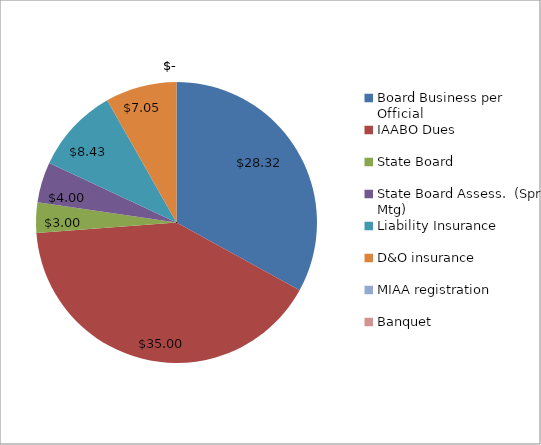
| Category | Series 0 |
|---|---|
| Board Business per Official | 28.318 |
| IAABO Dues | 35 |
| State Board | 3 |
| State Board Assess.  (Spr Mtg) | 4 |
| Liability Insurance | 8.429 |
| D&O insurance | 7.048 |
| MIAA registration | 0 |
| Banquet | 0 |